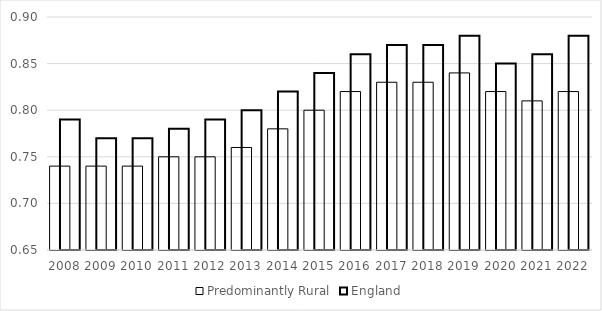
| Category | Predominantly Rural | England |
|---|---|---|
| 2008.0 | 0.74 | 0.79 |
| 2009.0 | 0.74 | 0.77 |
| 2010.0 | 0.74 | 0.77 |
| 2011.0 | 0.75 | 0.78 |
| 2012.0 | 0.75 | 0.79 |
| 2013.0 | 0.76 | 0.8 |
| 2014.0 | 0.78 | 0.82 |
| 2015.0 | 0.8 | 0.84 |
| 2016.0 | 0.82 | 0.86 |
| 2017.0 | 0.83 | 0.87 |
| 2018.0 | 0.83 | 0.87 |
| 2019.0 | 0.84 | 0.88 |
| 2020.0 | 0.82 | 0.85 |
| 2021.0 | 0.81 | 0.86 |
| 2022.0 | 0.82 | 0.88 |